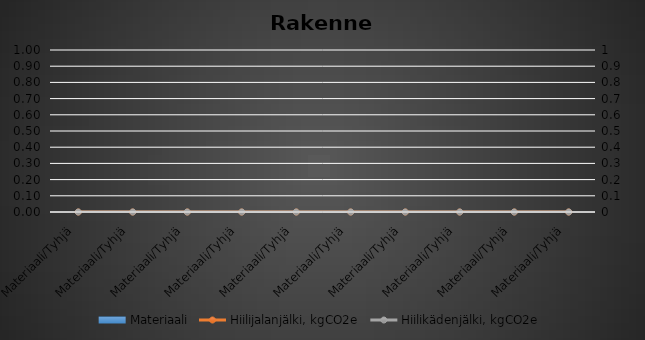
| Category | Materiaali |
|---|---|
| Materiaali/Tyhjä | 0 |
| Materiaali/Tyhjä | 0 |
| Materiaali/Tyhjä | 0 |
| Materiaali/Tyhjä | 0 |
| Materiaali/Tyhjä | 0 |
| Materiaali/Tyhjä | 0 |
| Materiaali/Tyhjä | 0 |
| Materiaali/Tyhjä | 0 |
| Materiaali/Tyhjä | 0 |
| Materiaali/Tyhjä | 0 |